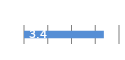
| Category | Series 0 |
|---|---|
| 0 | 3.362 |